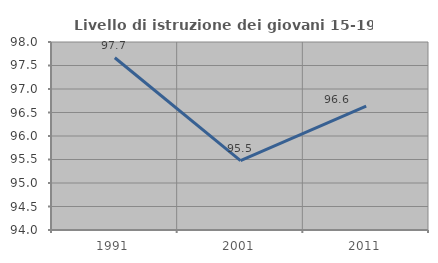
| Category | Livello di istruzione dei giovani 15-19 anni |
|---|---|
| 1991.0 | 97.665 |
| 2001.0 | 95.477 |
| 2011.0 | 96.635 |